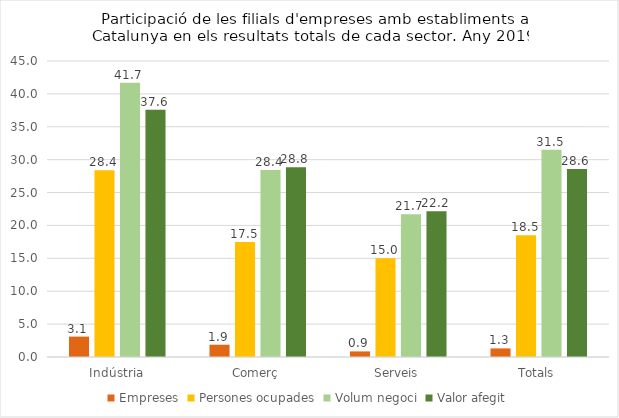
| Category | Empreses | Persones ocupades | Volum negoci | Valor afegit |
|---|---|---|---|---|
| Indústria | 3.1 | 28.4 | 41.7 | 37.6 |
| Comerç | 1.867 | 17.469 | 28.444 | 28.833 |
| Serveis | 0.85 | 15.001 | 21.72 | 22.177 |
| Totals | 1.307 | 18.5 | 31.5 | 28.6 |